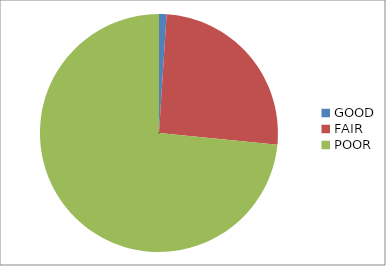
| Category | Series 0 |
|---|---|
| GOOD | 2.26 |
| FAIR | 56.599 |
| POOR | 162.609 |